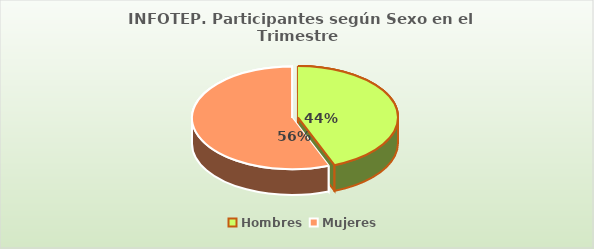
| Category | Series 0 |
|---|---|
| Hombres | 112245 |
| Mujeres | 142540 |